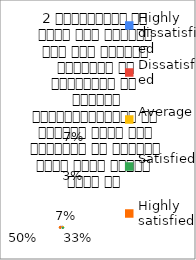
| Category | 2 व्याख्यान से रूचि में वृद्धि हुई एवं शिक्षण जानकारी से परिपूर्ण था 
शिक्षक विद्यार्थियों के द्वारा पूछे गये प्रश्नो का समाधान करने हेतु तत्पर  रहते है  |
|---|---|
| Highly dissatisfied | 4 |
| Dissatisfied | 2 |
| Average | 4 |
| Satisfied | 20 |
| Highly satisfied | 30 |